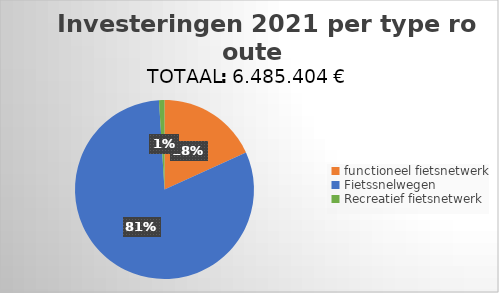
| Category | Series 0 |
|---|---|
| functioneel fietsnetwerk | 0.182 |
| Fietssnelwegen | 0.808 |
| Recreatief fietsnetwerk | 0.01 |